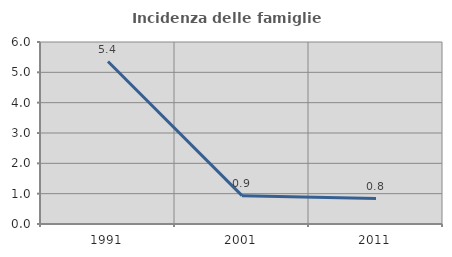
| Category | Incidenza delle famiglie numerose |
|---|---|
| 1991.0 | 5.357 |
| 2001.0 | 0.935 |
| 2011.0 | 0.84 |